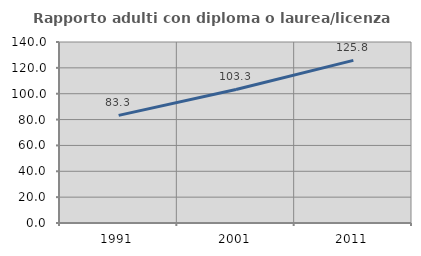
| Category | Rapporto adulti con diploma o laurea/licenza media  |
|---|---|
| 1991.0 | 83.271 |
| 2001.0 | 103.317 |
| 2011.0 | 125.764 |